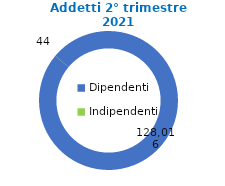
| Category | 50 addetti e oltre |
|---|---|
| Dipendenti | 128016 |
| Indipendenti | 44 |